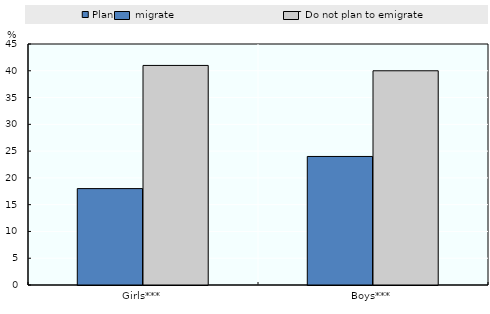
| Category | Plan to emigrate | Do not plan to emigrate |
|---|---|---|
| Girls*** | 18 | 41 |
| Boys*** | 24 | 40 |